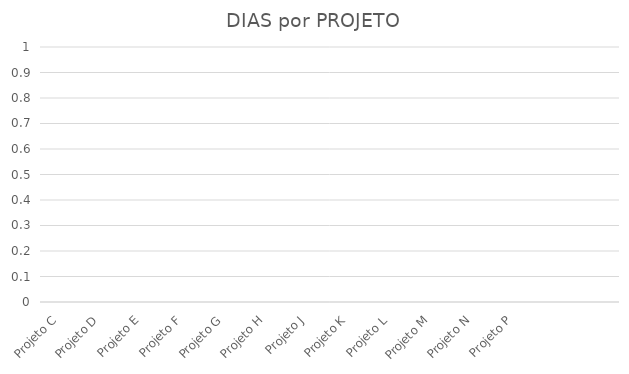
| Category | N.º de DIAS |
|---|---|
| Projeto C | 0 |
| Projeto D | 0 |
| Projeto E | 0 |
| Projeto F | 0 |
| Projeto G | 0 |
| Projeto H | 0 |
| Projeto J | 0 |
| Projeto K | 0 |
| Projeto L | 0 |
| Projeto M | 0 |
| Projeto N | 0 |
| Projeto P | 0 |